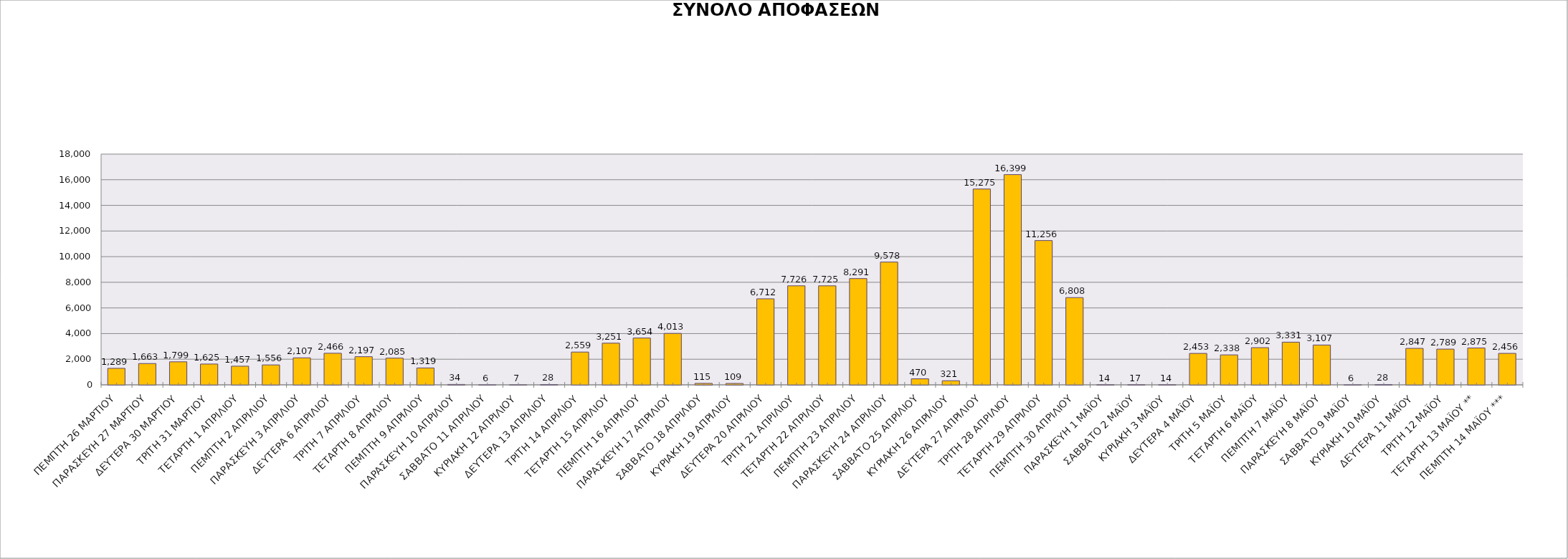
| Category | (16) 
ΑΠΟΦΑΣΕΙΣ ΡΥΘΜΙΣΗΣ


(1)+(4)+(7)+(10)+(13) |
|---|---|
| ΠΕΜΠΤΗ 26 ΜΑΡΤΙΟΥ | 1289 |
| ΠΑΡΑΣΚΕΥΗ 27 ΜΑΡΤΙΟΥ | 1663 |
| ΔΕΥΤΕΡΑ 30 ΜΑΡΤΙΟΥ | 1799 |
| ΤΡΙΤΗ 31 ΜΑΡΤΙΟΥ | 1625 |
| ΤΕΤΑΡΤΗ 1 ΑΠΡΙΛΙΟΥ | 1457 |
| ΠΕΜΠΤΗ 2 ΑΠΡΙΛΙΟΥ | 1556 |
| ΠΑΡΑΣΚΕΥΗ 3 ΑΠΡΙΛΙΟΥ | 2107 |
| ΔΕΥΤΕΡΑ 6 ΑΠΡΙΛΙΟΥ | 2466 |
| ΤΡΙΤΗ 7 ΑΠΡΙΛΙΟΥ | 2197 |
| ΤΕΤΑΡΤΗ 8 ΑΠΡΙΛΙΟΥ | 2085 |
| ΠΕΜΠΤΗ 9 ΑΠΡΙΛΙΟΥ | 1319 |
| ΠΑΡΑΣΚΕΥΗ 10 ΑΠΡΙΛΙΟΥ | 34 |
| ΣΑΒΒΑΤΟ 11 ΑΠΡΙΛΙΟΥ | 6 |
| ΚΥΡΙΑΚΗ 12 ΑΠΡΙΛΙΟΥ | 7 |
| ΔΕΥΤΕΡΑ 13 ΑΠΡΙΛΙΟΥ | 28 |
| ΤΡΙΤΗ 14 ΑΠΡΙΛΙΟΥ | 2559 |
| ΤΕΤΑΡΤΗ 15 ΑΠΡΙΛΙΟΥ | 3251 |
| ΠΕΜΠΤΗ 16 ΑΠΡΙΛΙΟΥ | 3654 |
| ΠΑΡΑΣΚΕΥΗ 17 ΑΠΡΙΛΙΟΥ | 4013 |
| ΣΑΒΒΑΤΟ 18 ΑΠΡΙΛΙΟΥ | 115 |
| ΚΥΡΙΑΚΗ 19 ΑΠΡΙΛΙΟΥ | 109 |
| ΔΕΥΤΕΡΑ 20 ΑΠΡΙΛΙΟΥ | 6712 |
| ΤΡΙΤΗ 21 ΑΠΡΙΛΙΟΥ | 7726 |
| ΤΕΤΑΡΤΗ 22 ΑΠΡΙΛΙΟΥ | 7725 |
| ΠΕΜΠΤΗ 23 ΑΠΡΙΛΙΟΥ | 8291 |
| ΠΑΡΑΣΚΕΥΗ 24 ΑΠΡΙΛΙΟΥ | 9578 |
| ΣΑΒΒΑΤΟ 25 ΑΠΡΙΛΙΟΥ | 470 |
| ΚΥΡΙΑΚΗ 26 ΑΠΡΙΛΙΟΥ | 321 |
| ΔΕΥΤΕΡΑ 27 ΑΠΡΙΛΙΟΥ | 15275 |
| ΤΡΙΤΗ 28 ΑΠΡΙΛΙΟΥ | 16399 |
| ΤΕΤΑΡΤΗ 29 ΑΠΡΙΛΙΟΥ | 11256 |
| ΠΕΜΠΤΗ 30 ΑΠΡΙΛΙΟΥ | 6808 |
| ΠΑΡΑΣΚΕΥΗ 1 ΜΑΪΟΥ | 14 |
| ΣΑΒΒΑΤΟ 2 ΜΑΪΟΥ | 17 |
| ΚΥΡΙΑΚΗ 3 ΜΑΪΟΥ | 14 |
| ΔΕΥΤΕΡΑ 4 ΜΑΪΟΥ | 2453 |
| ΤΡΙΤΗ 5 ΜΑΪΟΥ | 2338 |
| ΤΕΤΑΡΤΗ 6 ΜΑΪΟΥ | 2902 |
| ΠΕΜΠΤΗ 7 ΜΑΪΟΥ | 3331 |
| ΠΑΡΑΣΚΕΥΗ 8 ΜΑΪΟΥ | 3107 |
| ΣΑΒΒΑΤΟ 9 ΜΑΪΟΥ | 6 |
| ΚΥΡΙΑΚΗ 10 ΜΑΪΟΥ | 28 |
| ΔΕΥΤΕΡΑ 11 ΜΑΪΟΥ | 2847 |
| ΤΡΙΤΗ 12 ΜΑΪΟΥ | 2789 |
| ΤΕΤΑΡΤΗ 13 ΜΑΪΟΥ ** | 2875 |
| ΠΕΜΠΤΗ 14 ΜΑΪΟΥ *** | 2456 |